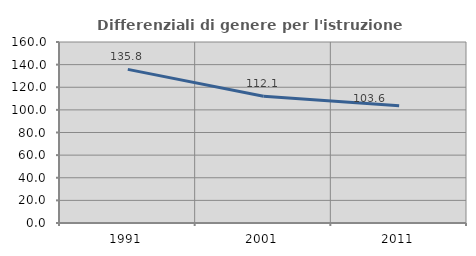
| Category | Differenziali di genere per l'istruzione superiore |
|---|---|
| 1991.0 | 135.824 |
| 2001.0 | 112.071 |
| 2011.0 | 103.627 |